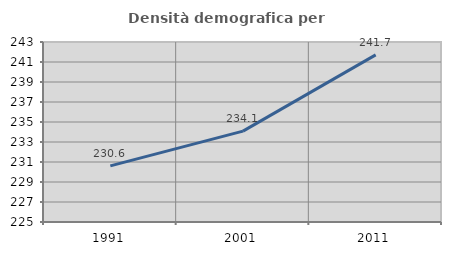
| Category | Densità demografica |
|---|---|
| 1991.0 | 230.609 |
| 2001.0 | 234.091 |
| 2011.0 | 241.71 |